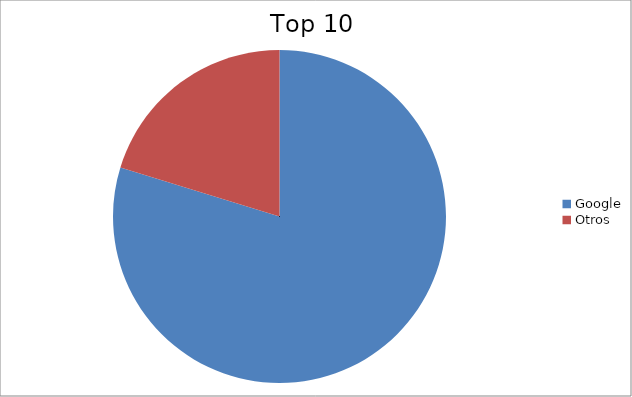
| Category | Series 0 |
|---|---|
| Google | 79.76 |
| Otros | 20.24 |